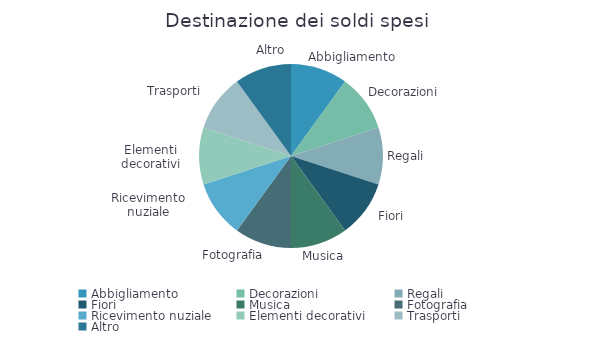
| Category | Importo |
|---|---|
| Abbigliamento | 1 |
| Decorazioni | 1 |
| Regali | 1 |
| Fiori | 1 |
| Musica | 1 |
| Fotografia | 1 |
| Ricevimento nuziale | 1 |
| Elementi decorativi | 1 |
| Trasporti | 1 |
| Altro | 1 |